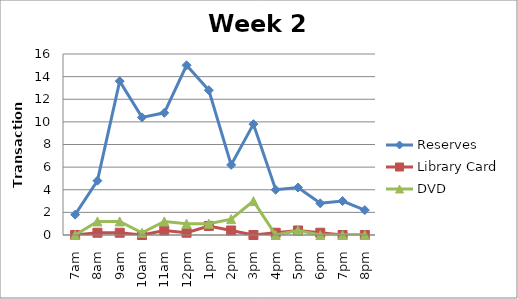
| Category | Reserves | Library Card | DVD |
|---|---|---|---|
| 7am | 1.8 | 0 | 0 |
| 8am | 4.8 | 0.2 | 1.2 |
| 9am | 13.6 | 0.2 | 1.2 |
| 10am | 10.4 | 0 | 0.2 |
| 11am | 10.8 | 0.4 | 1.2 |
| 12pm | 15 | 0.2 | 1 |
| 1pm | 12.8 | 0.8 | 1 |
| 2pm | 6.2 | 0.4 | 1.4 |
| 3pm | 9.8 | 0 | 3 |
| 4pm | 4 | 0.2 | 0 |
| 5pm | 4.2 | 0.4 | 0.4 |
| 6pm | 2.8 | 0.2 | 0 |
| 7pm | 3 | 0 | 0 |
| 8pm | 2.2 | 0 | 0 |